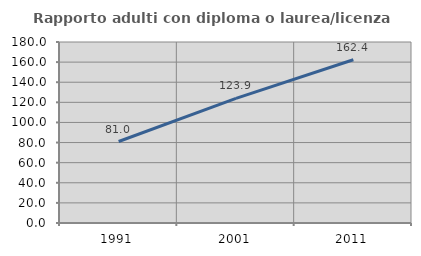
| Category | Rapporto adulti con diploma o laurea/licenza media  |
|---|---|
| 1991.0 | 81.046 |
| 2001.0 | 123.918 |
| 2011.0 | 162.368 |